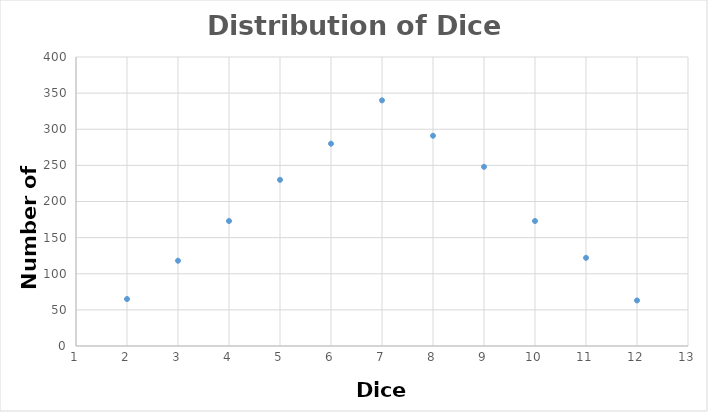
| Category | Series 0 |
|---|---|
| 2.0 | 65 |
| 3.0 | 118 |
| 4.0 | 173 |
| 5.0 | 230 |
| 6.0 | 280 |
| 7.0 | 340 |
| 8.0 | 291 |
| 9.0 | 248 |
| 10.0 | 173 |
| 11.0 | 122 |
| 12.0 | 63 |